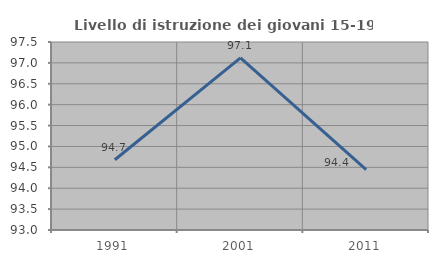
| Category | Livello di istruzione dei giovani 15-19 anni |
|---|---|
| 1991.0 | 94.681 |
| 2001.0 | 97.12 |
| 2011.0 | 94.444 |